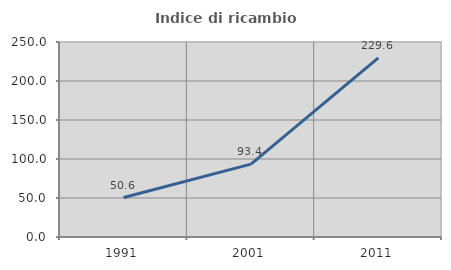
| Category | Indice di ricambio occupazionale  |
|---|---|
| 1991.0 | 50.612 |
| 2001.0 | 93.434 |
| 2011.0 | 229.63 |